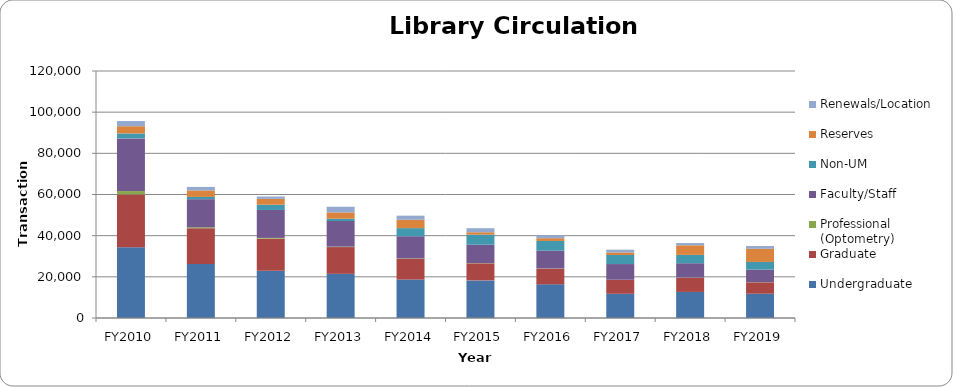
| Category | Undergraduate | Graduate | Professional (Optometry) | Faculty/Staff | Non-UM | Reserves | Renewals/Location |
|---|---|---|---|---|---|---|---|
| FY2010 | 34370 | 25662 | 1639 | 25581 | 2395 | 3534 | 2508 |
| FY2011 | 26276 | 17307 | 491 | 13647 | 1088 | 3171 | 1693 |
| FY2012 | 22931 | 15623 | 354 | 13584 | 2530 | 2847 | 1165 |
| FY2013 | 21459 | 12998 | 215 | 12443 | 1108 | 3074 | 2750 |
| FY2014 | 18691 | 10114 | 145 | 10766 | 3939 | 4078 | 1979 |
| FY2015 | 18277 | 8270 | 127 | 8925 | 4900 | 1167 | 1964 |
| FY2016 | 16356 | 7597 | 122 | 8603 | 4749 | 1336 | 1367 |
| FY2017 | 11762 | 6697 | 115 | 7631 | 4403 | 1215 | 1363 |
| FY2018 | 12668 | 6859 | 118 | 6966 | 4059 | 4664 | 1104 |
| FY2019 | 11795 | 5531 | 79 | 6101 | 3718 | 6398 | 1365 |